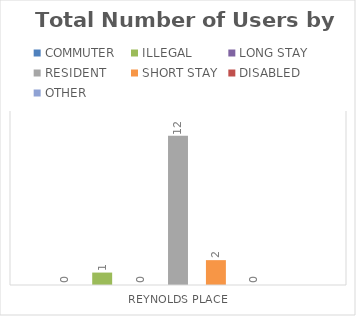
| Category | COMMUTER | ILLEGAL | LONG STAY | RESIDENT | SHORT STAY | DISABLED | OTHER |
|---|---|---|---|---|---|---|---|
| REYNOLDS PLACE | 0 | 1 | 0 | 12 | 2 | 0 | 0 |